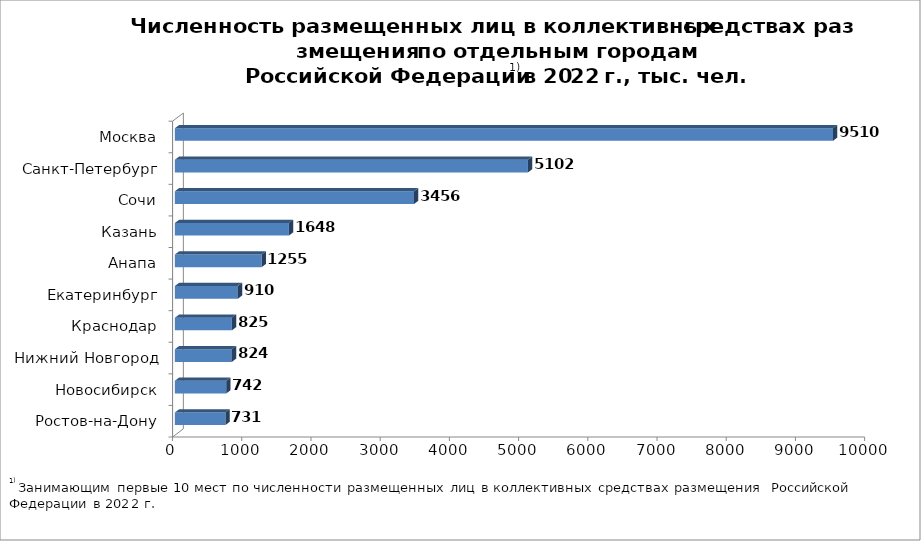
| Category | Series 0 |
|---|---|
| Ростов-на-Дону | 731.296 |
| Новосибирск | 742.364 |
| Нижний Новгород | 823.763 |
| Краснодар | 824.755 |
| Екатеринбург | 910.073 |
| Анапа | 1254.739 |
| Казань | 1648.447 |
| Сочи | 3456.421 |
| Санкт-Петербург | 5102.214 |
| Москва | 9510.284 |